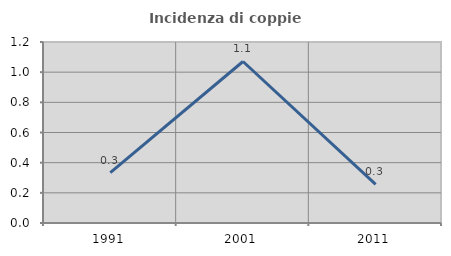
| Category | Incidenza di coppie miste |
|---|---|
| 1991.0 | 0.334 |
| 2001.0 | 1.071 |
| 2011.0 | 0.256 |